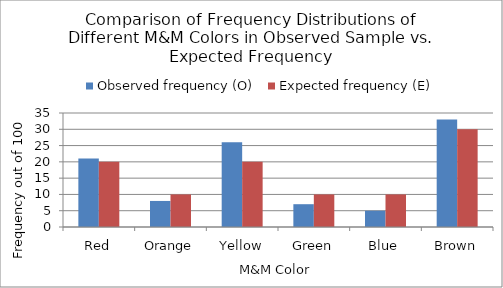
| Category | Observed frequency (O) | Expected frequency (E) |
|---|---|---|
| Red | 21 | 20 |
| Orange | 8 | 10 |
| Yellow | 26 | 20 |
| Green | 7 | 10 |
| Blue | 5 | 10 |
| Brown | 33 | 30 |